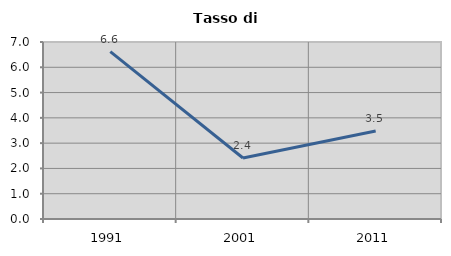
| Category | Tasso di disoccupazione   |
|---|---|
| 1991.0 | 6.618 |
| 2001.0 | 2.411 |
| 2011.0 | 3.481 |